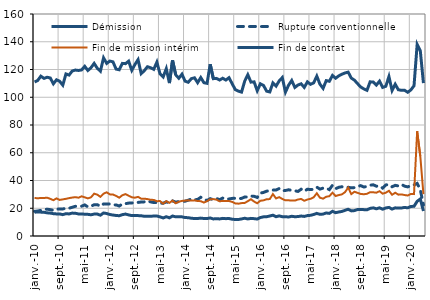
| Category | Démission | Rupture conventionnelle | Fin de mission intérim | Fin de contrat |
|---|---|---|---|---|
| 2010-01-01 | 17.1 | 17.8 | 27.4 | 111 |
| 2010-02-01 | 17.4 | 18 | 27.2 | 112.1 |
| 2010-03-01 | 17.2 | 18.5 | 27.4 | 115.2 |
| 2010-04-01 | 17.1 | 19.2 | 27.4 | 113.6 |
| 2010-05-01 | 16.7 | 19.3 | 27.6 | 114.4 |
| 2010-06-01 | 16.5 | 19 | 26.8 | 113.9 |
| 2010-07-01 | 16.1 | 18.5 | 25.8 | 109.7 |
| 2010-08-01 | 15.9 | 19.4 | 27.1 | 112.6 |
| 2010-09-01 | 15.9 | 19.4 | 26 | 111.5 |
| 2010-10-01 | 15.4 | 19.5 | 26.4 | 108.7 |
| 2010-11-01 | 16.1 | 20 | 26.8 | 116.8 |
| 2010-12-01 | 15.9 | 20 | 27.3 | 116 |
| 2011-01-01 | 16.5 | 20.7 | 27.7 | 118.9 |
| 2011-02-01 | 16.4 | 21.4 | 28 | 119.6 |
| 2011-03-01 | 15.9 | 21.3 | 27.6 | 119.3 |
| 2011-04-01 | 15.9 | 21.5 | 28.6 | 119.7 |
| 2011-05-01 | 15.7 | 22.4 | 27.9 | 122.3 |
| 2011-06-01 | 15.6 | 21 | 27.1 | 119.3 |
| 2011-07-01 | 15.3 | 21.5 | 27.9 | 121.3 |
| 2011-08-01 | 15.8 | 22.5 | 30.5 | 124.4 |
| 2011-09-01 | 15.8 | 22.6 | 29.8 | 120.9 |
| 2011-10-01 | 15 | 21.4 | 28.2 | 118.8 |
| 2011-11-01 | 16.6 | 23.1 | 30.5 | 128.4 |
| 2011-12-01 | 16.2 | 23 | 31.5 | 124.4 |
| 2012-01-01 | 15.5 | 23.1 | 30 | 126.1 |
| 2012-02-01 | 15.1 | 22.4 | 29.9 | 125.5 |
| 2012-03-01 | 14.8 | 22.4 | 28.9 | 120.3 |
| 2012-04-01 | 14.6 | 21.6 | 27.6 | 119.8 |
| 2012-05-01 | 15.4 | 23.1 | 29.4 | 124.4 |
| 2012-06-01 | 15.8 | 23.3 | 30.2 | 124.2 |
| 2012-07-01 | 15.2 | 23.7 | 29 | 126 |
| 2012-08-01 | 14.7 | 23.8 | 27.9 | 119.4 |
| 2012-09-01 | 14.7 | 24.1 | 27.6 | 123.6 |
| 2012-10-01 | 14.7 | 24.2 | 28.2 | 127.1 |
| 2012-11-01 | 14.6 | 24.5 | 26.9 | 117 |
| 2012-12-01 | 14.2 | 24.6 | 26.9 | 119.2 |
| 2013-01-01 | 14.3 | 25.3 | 26.6 | 122 |
| 2013-02-01 | 14.2 | 24.6 | 26.1 | 121.3 |
| 2013-03-01 | 14.4 | 24.1 | 26 | 120.1 |
| 2013-04-01 | 14.4 | 24.1 | 25.1 | 125.3 |
| 2013-05-01 | 13.8 | 23.7 | 25.2 | 116.9 |
| 2013-06-01 | 13 | 23.6 | 23.3 | 114.6 |
| 2013-07-01 | 13.9 | 24.6 | 25.1 | 120.6 |
| 2013-08-01 | 13.1 | 23.7 | 23.9 | 110.2 |
| 2013-09-01 | 14.4 | 25.3 | 25.5 | 126.6 |
| 2013-10-01 | 13.8 | 24.4 | 23.6 | 116.2 |
| 2013-11-01 | 13.8 | 24.8 | 24.7 | 113.7 |
| 2013-12-01 | 13.8 | 24.9 | 25.3 | 116.6 |
| 2014-01-01 | 13.3 | 25.1 | 25.5 | 111.6 |
| 2014-02-01 | 13.2 | 25.8 | 25.7 | 110.8 |
| 2014-03-01 | 12.8 | 26.7 | 25.5 | 113.4 |
| 2014-04-01 | 12.6 | 26 | 25.7 | 114 |
| 2014-05-01 | 12.6 | 26.4 | 25.2 | 110.5 |
| 2014-06-01 | 12.9 | 27.9 | 25.1 | 114.2 |
| 2014-07-01 | 12.6 | 26.5 | 24.1 | 110.5 |
| 2014-08-01 | 12.6 | 25.6 | 25.1 | 110 |
| 2014-09-01 | 13 | 26.9 | 26.5 | 123.8 |
| 2014-10-01 | 12.3 | 26.2 | 26.6 | 113.4 |
| 2014-11-01 | 12.5 | 27 | 26.2 | 113.6 |
| 2014-12-01 | 12.3 | 26.2 | 25 | 112.4 |
| 2015-01-01 | 12.7 | 27.3 | 25.3 | 113.7 |
| 2015-02-01 | 12.5 | 26.5 | 25.3 | 112.4 |
| 2015-03-01 | 12.6 | 26.7 | 25.2 | 114.1 |
| 2015-04-01 | 12.1 | 27.1 | 24.6 | 109.8 |
| 2015-05-01 | 11.9 | 27.2 | 23.5 | 105.5 |
| 2015-06-01 | 11.9 | 26.9 | 23.3 | 104.4 |
| 2015-07-01 | 12.3 | 27.1 | 23.7 | 103.7 |
| 2015-08-01 | 12.8 | 28.1 | 23.8 | 111.6 |
| 2015-09-01 | 12.3 | 28.1 | 25.1 | 116.2 |
| 2015-10-01 | 12.7 | 28.8 | 26.5 | 110.9 |
| 2015-11-01 | 12.5 | 28.6 | 24.8 | 111.1 |
| 2015-12-01 | 12.2 | 27.8 | 23.6 | 104.7 |
| 2016-01-01 | 13.3 | 30.9 | 25.4 | 109.7 |
| 2016-02-01 | 13.8 | 31.4 | 25.7 | 108.5 |
| 2016-03-01 | 13.9 | 32.3 | 26.5 | 104.4 |
| 2016-04-01 | 14.4 | 32.7 | 26.6 | 103.8 |
| 2016-05-01 | 15 | 33.1 | 30.2 | 110.3 |
| 2016-06-01 | 13.9 | 33.1 | 27.1 | 108 |
| 2016-07-01 | 14.5 | 34.2 | 28 | 111.8 |
| 2016-08-01 | 13.9 | 32.6 | 26.7 | 114.2 |
| 2016-09-01 | 13.9 | 32.8 | 25.7 | 103.7 |
| 2016-10-01 | 13.7 | 33.3 | 25.7 | 108.7 |
| 2016-11-01 | 14.2 | 32.9 | 25.6 | 112.1 |
| 2016-12-01 | 13.9 | 32.6 | 25.5 | 107.1 |
| 2017-01-01 | 14 | 32.1 | 26.3 | 108.8 |
| 2017-02-01 | 14.4 | 33.7 | 26.7 | 109.7 |
| 2017-03-01 | 14.1 | 32.2 | 25.4 | 107.1 |
| 2017-04-01 | 14.7 | 33.7 | 26.3 | 111.1 |
| 2017-05-01 | 14.9 | 33.5 | 26.8 | 109.3 |
| 2017-06-01 | 15.5 | 33.6 | 27.9 | 110.4 |
| 2017-07-01 | 16.3 | 35.2 | 30.8 | 115.2 |
| 2017-08-01 | 15.6 | 33.8 | 27.6 | 109.4 |
| 2017-09-01 | 15.8 | 34.5 | 26.9 | 106.4 |
| 2017-10-01 | 16.6 | 34.5 | 28.3 | 112 |
| 2017-11-01 | 16.3 | 33.4 | 28.7 | 111.5 |
| 2017-12-01 | 17.8 | 36.6 | 31.2 | 115.7 |
| 2018-01-01 | 16.8 | 34.1 | 28.8 | 113.7 |
| 2018-02-01 | 17.3 | 35.1 | 29.5 | 115.4 |
| 2018-03-01 | 17.7 | 35.5 | 30 | 116.6 |
| 2018-04-01 | 18.5 | 35.1 | 31.6 | 117.5 |
| 2018-05-01 | 19.3 | 35.1 | 34.9 | 118.1 |
| 2018-06-01 | 18.1 | 34.7 | 30.2 | 113.8 |
| 2018-07-01 | 18.3 | 34.9 | 31.9 | 112.3 |
| 2018-08-01 | 19.1 | 35.7 | 31.1 | 109.8 |
| 2018-09-01 | 19.1 | 36.3 | 30.3 | 107.4 |
| 2018-10-01 | 19 | 35.3 | 30.1 | 106 |
| 2018-11-01 | 18.9 | 35.7 | 30.4 | 105 |
| 2018-12-01 | 19.9 | 36.6 | 31.6 | 111.1 |
| 2019-01-01 | 20.3 | 36.9 | 31.5 | 111 |
| 2019-02-01 | 19.6 | 35.9 | 31.2 | 108.8 |
| 2019-03-01 | 20.3 | 36.1 | 32.3 | 111.6 |
| 2019-04-01 | 19.3 | 34.5 | 30.5 | 107.1 |
| 2019-05-01 | 20.2 | 36.8 | 31.2 | 107.9 |
| 2019-06-01 | 20.6 | 37.1 | 32.6 | 114.9 |
| 2019-07-01 | 19.4 | 35.5 | 29.7 | 104.9 |
| 2019-08-01 | 20.3 | 36.5 | 31.2 | 109.4 |
| 2019-09-01 | 20.1 | 36.1 | 29.8 | 105.4 |
| 2019-10-01 | 20.2 | 37.2 | 30 | 105 |
| 2019-11-01 | 20.6 | 35.9 | 29.5 | 105 |
| 2019-12-01 | 20.3 | 35.4 | 29.2 | 103.6 |
| 2020-01-01 | 21.3 | 36.4 | 30.3 | 105.3 |
| 2020-02-01 | 21.4 | 36.8 | 30.2 | 108.3 |
| 2020-03-01 | 25 | 37.9 | 75.5 | 138.1 |
| 2020-04-01 | 26.7 | 33.4 | 57.5 | 133.5 |
| 2020-05-01 | 18 | 22.4 | 30.2 | 110.2 |